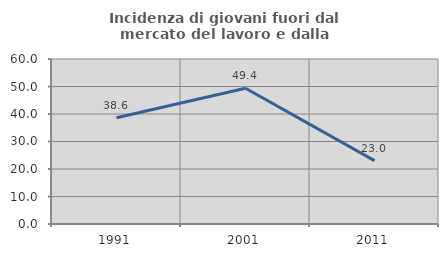
| Category | Incidenza di giovani fuori dal mercato del lavoro e dalla formazione  |
|---|---|
| 1991.0 | 38.646 |
| 2001.0 | 49.37 |
| 2011.0 | 23.049 |